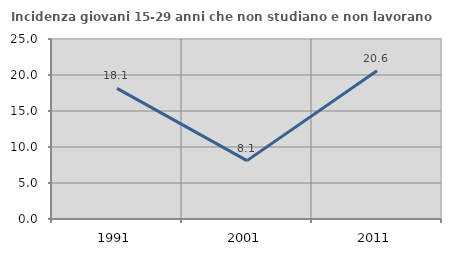
| Category | Incidenza giovani 15-29 anni che non studiano e non lavorano  |
|---|---|
| 1991.0 | 18.138 |
| 2001.0 | 8.108 |
| 2011.0 | 20.588 |